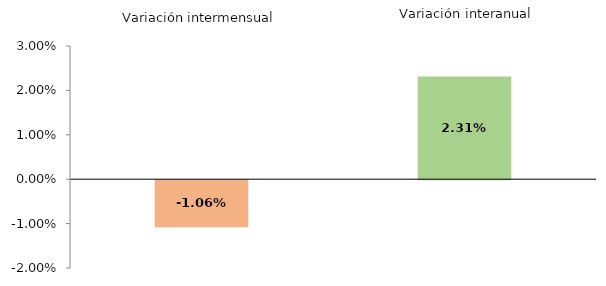
| Category | Series 0 |
|---|---|
| 0 | -1.06 |
| 1 | 2.313 |